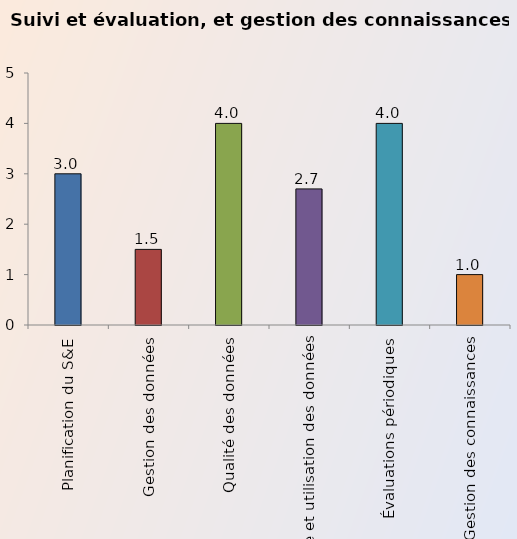
| Category | Series 0 |
|---|---|
| Planification du S&E | 3 |
| Gestion des données | 1.5 |
| Qualité des données | 4 |
| Analyse et utilisation des données | 2.7 |
| Évaluations périodiques | 4 |
| Gestion des connaissances | 1 |